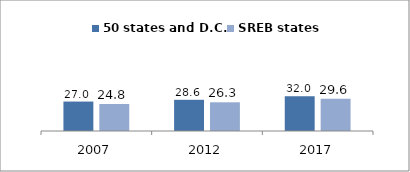
| Category | 50 states and D.C. | SREB states |
|---|---|---|
| 2007.0 | 27.018 | 24.797 |
| 2012.0 | 28.637 | 26.333 |
| 2017.0 | 31.985 | 29.638 |